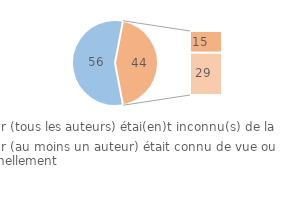
| Category | Series 0 |
|---|---|
| L'auteur (tous les auteurs) étai(en)t inconnu(s) de la victime | 56 |
| Ne sait pas/Refus | 0 |
| L'auteur (au moins un auteur) était connu de vue ou personnellement  | 15 |
|  | 29 |